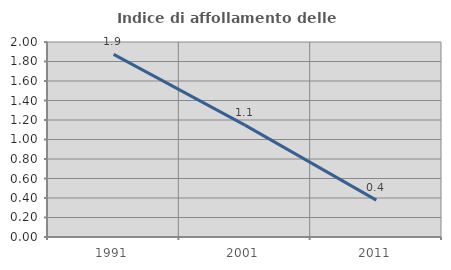
| Category | Indice di affollamento delle abitazioni  |
|---|---|
| 1991.0 | 1.874 |
| 2001.0 | 1.148 |
| 2011.0 | 0.378 |